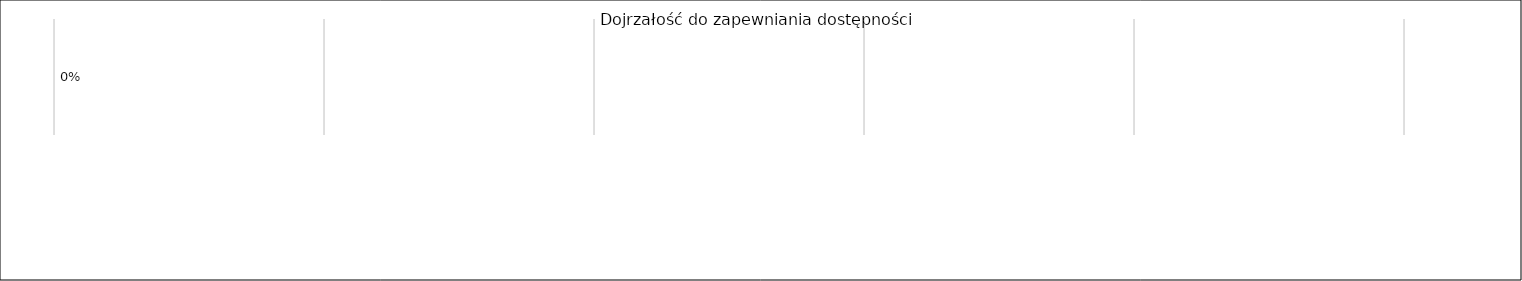
| Category | Ogółem punktów |
|---|---|
| 0 | 0 |